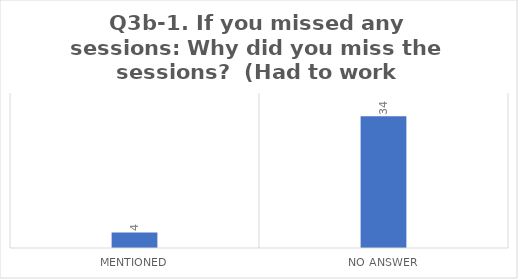
| Category | Q3b-1. If you missed any sessions: Why did you miss the sessions?  (Had to work instead) |
|---|---|
| Mentioned | 4 |
| No Answer | 34 |